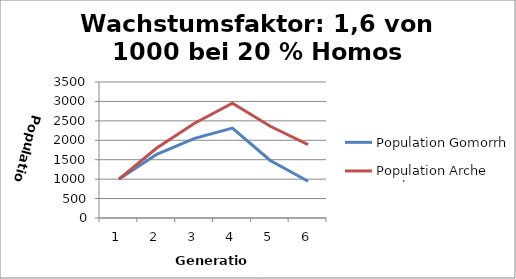
| Category | Population Gomorrha | Population Arche Noah |
|---|---|---|
| 0 | 1000 | 1000 |
| 1 | 1640 | 1800 |
| 2 | 2049.6 | 2440 |
| 3 | 2311.744 | 2952 |
| 4 | 1479.516 | 2361.6 |
| 5 | 946.89 | 1889.28 |